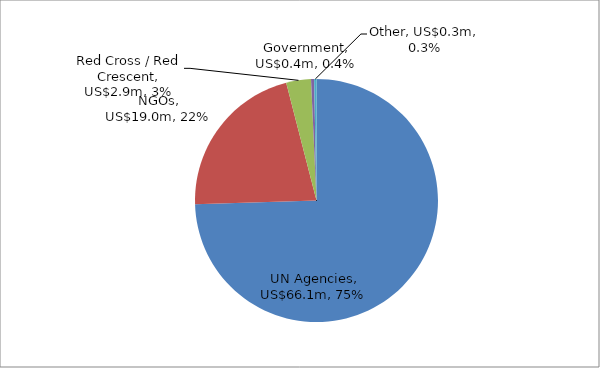
| Category | Total |
|---|---|
| UN Agencies | 66.073 |
| NGOs | 19.035 |
| Red Cross / Red Crescent | 2.92 |
| Government | 0.361 |
| Other | 0.278 |